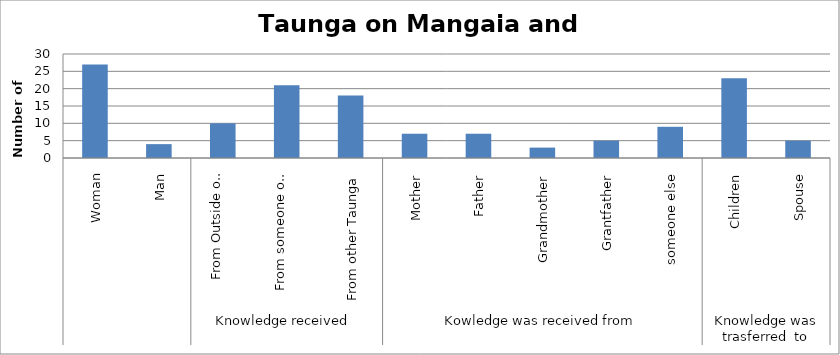
| Category | Series 0 |
|---|---|
| 0 | 27 |
| 1 | 4 |
| 2 | 10 |
| 3 | 21 |
| 4 | 18 |
| 5 | 7 |
| 6 | 7 |
| 7 | 3 |
| 8 | 5 |
| 9 | 9 |
| 10 | 23 |
| 11 | 5 |